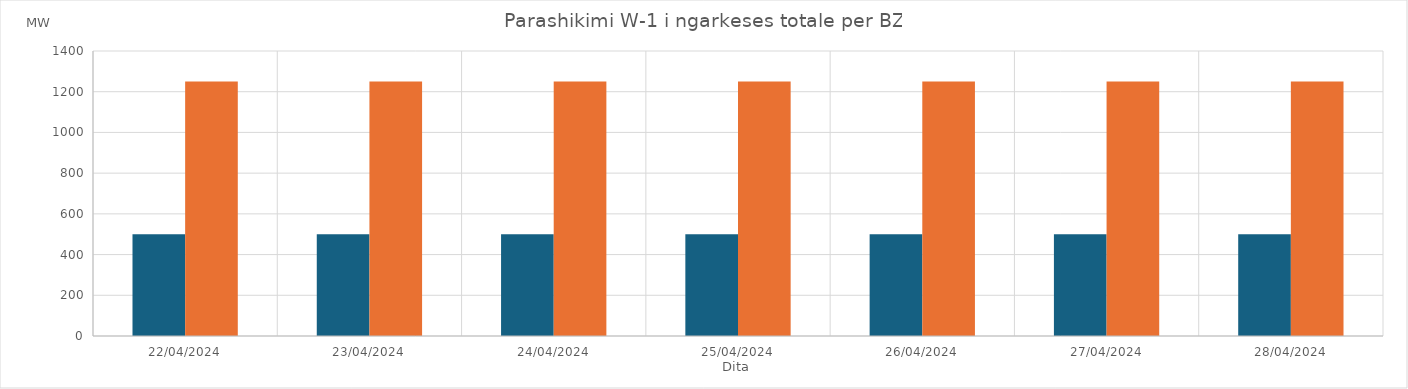
| Category | Min (MW) | Max (MW) |
|---|---|---|
| 22/04/2024 | 500 | 1250 |
| 23/04/2024 | 500 | 1250 |
| 24/04/2024 | 500 | 1250 |
| 25/04/2024 | 500 | 1250 |
| 26/04/2024 | 500 | 1250 |
| 27/04/2024 | 500 | 1250 |
| 28/04/2024 | 500 | 1250 |